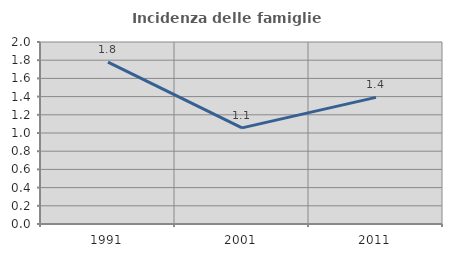
| Category | Incidenza delle famiglie numerose |
|---|---|
| 1991.0 | 1.778 |
| 2001.0 | 1.056 |
| 2011.0 | 1.392 |